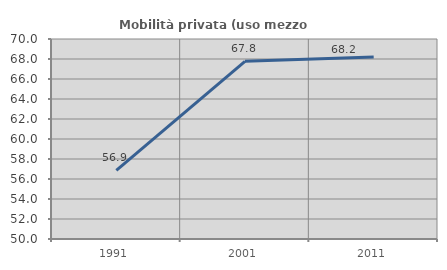
| Category | Mobilità privata (uso mezzo privato) |
|---|---|
| 1991.0 | 56.864 |
| 2001.0 | 67.77 |
| 2011.0 | 68.204 |